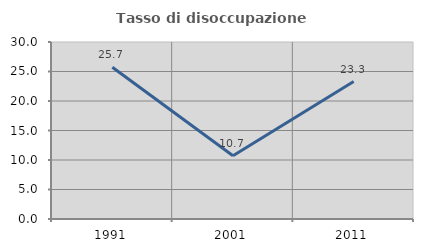
| Category | Tasso di disoccupazione giovanile  |
|---|---|
| 1991.0 | 25.723 |
| 2001.0 | 10.732 |
| 2011.0 | 23.295 |